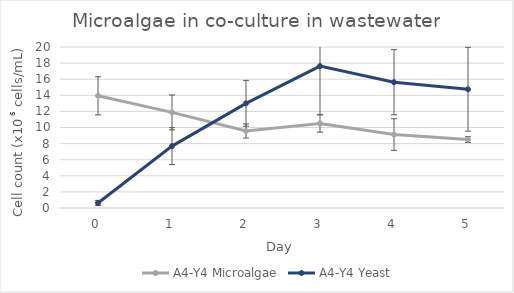
| Category | A4-Y4 Microalgae | A4-Y4 Yeast |
|---|---|---|
| 0.0 | 13.938 | 0.625 |
| 1.0 | 11.875 | 7.688 |
| 2.0 | 9.562 | 13 |
| 3.0 | 10.5 | 17.625 |
| 4.0 | 9.125 | 15.625 |
| 5.0 | 8.5 | 14.75 |